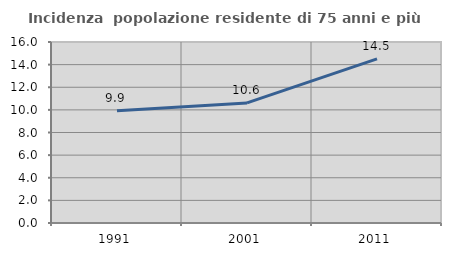
| Category | Incidenza  popolazione residente di 75 anni e più |
|---|---|
| 1991.0 | 9.924 |
| 2001.0 | 10.617 |
| 2011.0 | 14.505 |